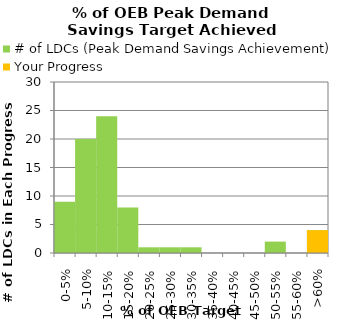
| Category | # of LDCs (Peak Demand Savings Achievement) | Your Progress |
|---|---|---|
| 0-5% | 9 | 0 |
| 5-10% | 20 | 0 |
| 10-15% | 24 | 0 |
| 15-20% | 8 | 0 |
| 20-25% | 1 | 0 |
| 25-30% | 1 | 0 |
| 30-35% | 1 | 0 |
| 35-40% | 0 | 0 |
| 40-45% | 0 | 0 |
| 45-50% | 0 | 0 |
| 50-55% | 2 | 0 |
| 55-60% | 0 | 0 |
| >60% | 4 | 4 |